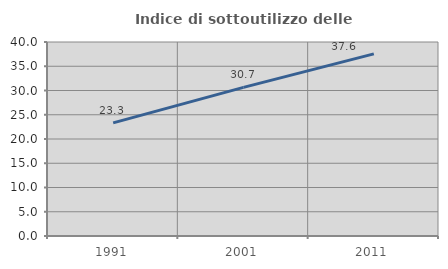
| Category | Indice di sottoutilizzo delle abitazioni  |
|---|---|
| 1991.0 | 23.331 |
| 2001.0 | 30.654 |
| 2011.0 | 37.551 |